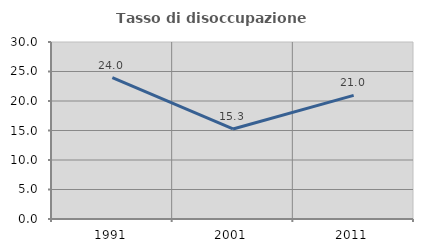
| Category | Tasso di disoccupazione giovanile  |
|---|---|
| 1991.0 | 23.975 |
| 2001.0 | 15.262 |
| 2011.0 | 20.961 |